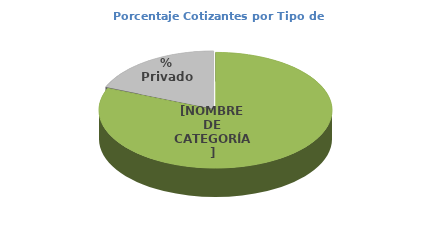
| Category | Series 0 |
|---|---|
| % Público | 0.811 |
| % Privado | 0.189 |